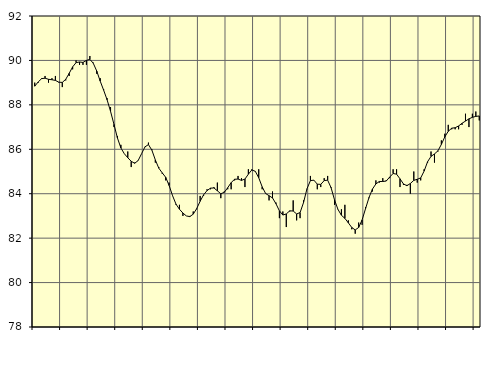
| Category | Piggar | Series 1 |
|---|---|---|
| nan | 89 | 88.84 |
| 87.0 | 89 | 89.03 |
| 87.0 | 89.2 | 89.18 |
| 87.0 | 89.3 | 89.2 |
| nan | 89 | 89.15 |
| 88.0 | 89.2 | 89.13 |
| 88.0 | 89.3 | 89.1 |
| 88.0 | 89 | 89.02 |
| nan | 88.8 | 89.01 |
| 89.0 | 89.1 | 89.15 |
| 89.0 | 89.3 | 89.42 |
| 89.0 | 89.6 | 89.71 |
| nan | 90 | 89.9 |
| 90.0 | 89.8 | 89.93 |
| 90.0 | 89.8 | 89.91 |
| 90.0 | 89.8 | 90 |
| nan | 90.2 | 90.05 |
| 91.0 | 89.9 | 89.87 |
| 91.0 | 89.4 | 89.52 |
| 91.0 | 89.2 | 89.07 |
| nan | 88.7 | 88.66 |
| 92.0 | 88.3 | 88.23 |
| 92.0 | 87.9 | 87.71 |
| 92.0 | 87 | 87.12 |
| nan | 86.6 | 86.51 |
| 93.0 | 86.2 | 86.06 |
| 93.0 | 85.8 | 85.8 |
| 93.0 | 85.9 | 85.62 |
| nan | 85.2 | 85.46 |
| 94.0 | 85.4 | 85.37 |
| 94.0 | 85.5 | 85.49 |
| 94.0 | 85.8 | 85.8 |
| nan | 86.1 | 86.11 |
| 95.0 | 86.3 | 86.21 |
| 95.0 | 86 | 85.96 |
| 95.0 | 85.4 | 85.52 |
| nan | 85.2 | 85.15 |
| 96.0 | 84.9 | 84.94 |
| 96.0 | 84.6 | 84.74 |
| 96.0 | 84.5 | 84.37 |
| nan | 83.9 | 83.91 |
| 97.0 | 83.5 | 83.53 |
| 97.0 | 83.5 | 83.3 |
| 97.0 | 83 | 83.13 |
| nan | 83 | 83 |
| 98.0 | 83 | 82.97 |
| 98.0 | 83.2 | 83.08 |
| 98.0 | 83.3 | 83.33 |
| nan | 83.9 | 83.66 |
| 99.0 | 83.9 | 83.95 |
| 99.0 | 84.2 | 84.14 |
| 99.0 | 84.2 | 84.25 |
| nan | 84.3 | 84.26 |
| 0.0 | 84.5 | 84.13 |
| 0.0 | 83.8 | 84 |
| 0.0 | 84.1 | 84.06 |
| nan | 84.2 | 84.27 |
| 1.0 | 84.2 | 84.5 |
| 1.0 | 84.6 | 84.65 |
| 1.0 | 84.8 | 84.66 |
| nan | 84.7 | 84.6 |
| 2.0 | 84.3 | 84.66 |
| 2.0 | 85.1 | 84.88 |
| 2.0 | 85.1 | 85.07 |
| nan | 85 | 85.01 |
| 3.0 | 85.1 | 84.72 |
| 3.0 | 84.2 | 84.31 |
| 3.0 | 84 | 84.01 |
| nan | 83.7 | 83.91 |
| 4.0 | 84.1 | 83.81 |
| 4.0 | 83.6 | 83.55 |
| 4.0 | 82.9 | 83.23 |
| nan | 83.2 | 83.04 |
| 5.0 | 82.5 | 83.09 |
| 5.0 | 83.2 | 83.23 |
| 5.0 | 83.7 | 83.22 |
| nan | 82.8 | 83.09 |
| 6.0 | 82.9 | 83.15 |
| 6.0 | 83.7 | 83.6 |
| 6.0 | 84.2 | 84.22 |
| nan | 84.8 | 84.59 |
| 7.0 | 84.6 | 84.61 |
| 7.0 | 84.2 | 84.43 |
| 7.0 | 84.3 | 84.42 |
| nan | 84.7 | 84.59 |
| 8.0 | 84.8 | 84.61 |
| 8.0 | 84.3 | 84.27 |
| 8.0 | 83.5 | 83.72 |
| nan | 83.3 | 83.29 |
| 9.0 | 83.3 | 83.03 |
| 9.0 | 83.5 | 82.89 |
| 9.0 | 82.8 | 82.69 |
| nan | 82.4 | 82.48 |
| 10.0 | 82.2 | 82.37 |
| 10.0 | 82.7 | 82.48 |
| 10.0 | 82.6 | 82.82 |
| nan | 83.4 | 83.33 |
| 11.0 | 83.8 | 83.83 |
| 11.0 | 84.1 | 84.21 |
| 11.0 | 84.6 | 84.44 |
| nan | 84.5 | 84.55 |
| 12.0 | 84.7 | 84.55 |
| 12.0 | 84.6 | 84.57 |
| 12.0 | 84.7 | 84.75 |
| nan | 85.1 | 84.91 |
| 13.0 | 85.1 | 84.88 |
| 13.0 | 84.3 | 84.67 |
| 13.0 | 84.4 | 84.44 |
| nan | 84.4 | 84.36 |
| 14.0 | 84 | 84.46 |
| 14.0 | 85 | 84.6 |
| 14.0 | 84.5 | 84.65 |
| nan | 84.6 | 84.71 |
| 15.0 | 85.1 | 85.02 |
| 15.0 | 85.4 | 85.44 |
| 15.0 | 85.9 | 85.68 |
| nan | 85.4 | 85.79 |
| 16.0 | 85.9 | 85.93 |
| 16.0 | 86.4 | 86.22 |
| 16.0 | 86.7 | 86.56 |
| nan | 87.1 | 86.81 |
| 17.0 | 86.9 | 86.95 |
| 17.0 | 86.9 | 86.97 |
| 17.0 | 86.9 | 87.05 |
| nan | 87.1 | 87.17 |
| 18.0 | 87.6 | 87.27 |
| 18.0 | 87 | 87.37 |
| 18.0 | 87.6 | 87.44 |
| nan | 87.7 | 87.48 |
| 19.0 | 87.3 | 87.5 |